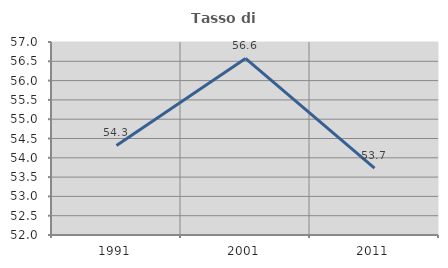
| Category | Tasso di occupazione   |
|---|---|
| 1991.0 | 54.32 |
| 2001.0 | 56.575 |
| 2011.0 | 53.731 |